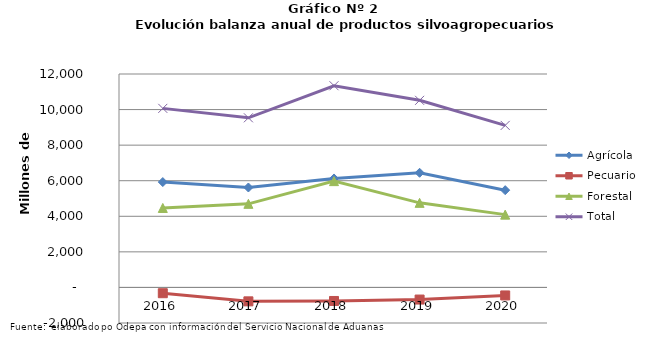
| Category | Agrícola | Pecuario | Forestal | Total |
|---|---|---|---|---|
| 2016.0 | 5924661 | -325421 | 4468104 | 10067344 |
| 2017.0 | 5619304 | -782654 | 4700192 | 9536842 |
| 2018.0 | 6126434 | -761998 | 5976134 | 11340570 |
| 2019.0 | 6445947 | -681711 | 4755333 | 10519569 |
| 2020.0 | 5467678 | -450859 | 4092891 | 9109710 |